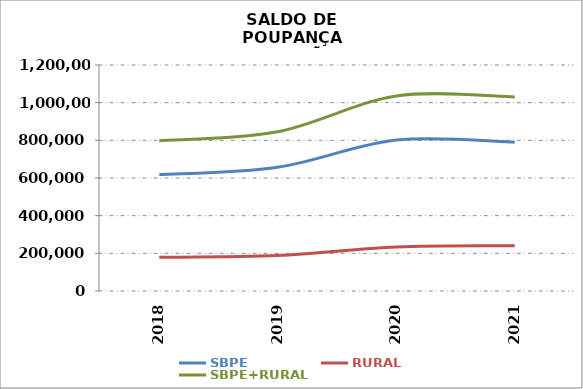
| Category | SBPE | RURAL | SBPE+RURAL |
|---|---|---|---|
| 2018 | 618146.063 | 179134.939 | 797281.002 |
| 2019 | 657531.442 | 187933.103 | 845464.545 |
| 2020 | 801437.985 | 234189.821 | 1035627.806 |
| 2021 | 790109.013 | 240493.997 | 1030603.01 |